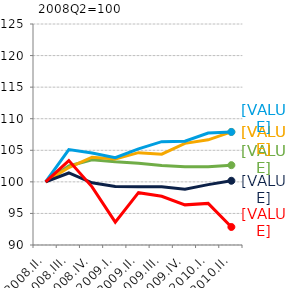
| Category | Északi országok | Mediterrán országok | KKE-régió | Magországok | Magyarország |
|---|---|---|---|---|---|
| 2008.II. | 100 | 100 | 100 | 100 | 100 |
| 2008.III. | 102.513 | 102.273 | 105.107 | 101.406 | 103.37 |
| 2008.IV. | 103.51 | 103.901 | 104.585 | 99.85 | 99.209 |
| 2009.I. | 103.189 | 103.611 | 103.832 | 99.262 | 93.626 |
| 2009.II. | 102.962 | 104.626 | 105.229 | 99.214 | 98.289 |
| 2009.III. | 102.578 | 104.382 | 106.365 | 99.23 | 97.723 |
| 2009.IV. | 102.411 | 106.1 | 106.435 | 98.824 | 96.356 |
| 2010.I. | 102.39 | 106.654 | 107.721 | 99.562 | 96.59 |
| 2010.II. | 102.644 | 107.905 | 107.901 | 100.171 | 92.854 |